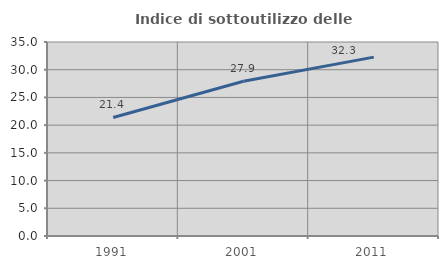
| Category | Indice di sottoutilizzo delle abitazioni  |
|---|---|
| 1991.0 | 21.382 |
| 2001.0 | 27.918 |
| 2011.0 | 32.274 |